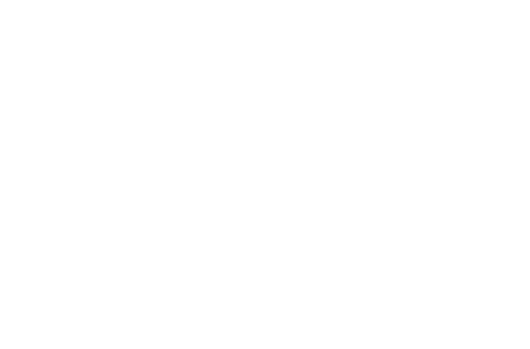
| Category | Amorteringsbelopp | Betald ränta |
|---|---|---|
| 2019 | 316.351 | 226.28 |
| 2020 | 1105.769 | 739.178 |
| 2021 | 1939.715 | 1207.547 |
| 2022 | 2820.703 | 1628.874 |
| 2023 | 3751.386 | 2000.507 |
| 2024 | 4734.566 | 2319.642 |
| 2025 | 5773.206 | 2583.318 |
| 2026 | 6870.433 | 2788.406 |
| 2027 | 8029.552 | 2931.602 |
| 2028 | 9254.054 | 3009.415 |
| 2029 | 10000 | 3023.153 |